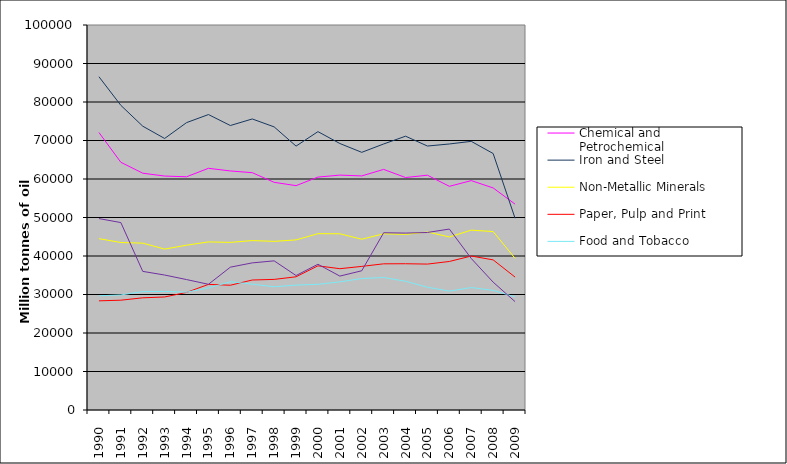
| Category | Chemical and Petrochemical | Iron and Steel | Non-Metallic Minerals | Paper, Pulp and Print | Food and Tobacco | Non-specified (Industry) |
|---|---|---|---|---|---|---|
| 1990.0 | 72076 | 86565 | 44506 | 28354 | 29671 | 49716 |
| 1991.0 | 64337 | 79131 | 43499 | 28519 | 29886 | 48685 |
| 1992.0 | 61504 | 73717 | 43340 | 29140 | 30747 | 36005 |
| 1993.0 | 60763 | 70525 | 41790 | 29356 | 30789 | 35056 |
| 1994.0 | 60579 | 74645 | 42806 | 30546 | 30605 | 33879 |
| 1995.0 | 62779 | 76741 | 43657 | 32627 | 31708 | 32650 |
| 1996.0 | 62094 | 73891 | 43538 | 32406 | 33311 | 37099 |
| 1997.0 | 61637 | 75596 | 44007 | 33763 | 32677 | 38214 |
| 1998.0 | 59139 | 73536 | 43800 | 33922 | 32014 | 38740 |
| 1999.0 | 58273 | 68544 | 44181 | 34601 | 32442 | 34927 |
| 2000.0 | 60496 | 72303 | 45799 | 37444 | 32641 | 37857 |
| 2001.0 | 61010 | 69218 | 45770 | 36704 | 33286 | 34783 |
| 2002.0 | 60803 | 66927 | 44351 | 37300 | 34147 | 36168 |
| 2003.0 | 62492 | 69097 | 45774 | 37970 | 34414 | 46042 |
| 2004.0 | 60378 | 71120 | 45612 | 37989 | 33438 | 45950 |
| 2005.0 | 60984 | 68561 | 46230 | 37898 | 31887 | 46108 |
| 2006.0 | 58098 | 69097 | 44944 | 38576 | 30879 | 47000 |
| 2007.0 | 59583 | 69780 | 46716 | 39996 | 31801 | 39354 |
| 2008.0 | 57678 | 66616 | 46344 | 38992 | 31075 | 33208 |
| 2009.0 | 53476 | 49812 | 39385 | 34528 | 29384 | 28152 |